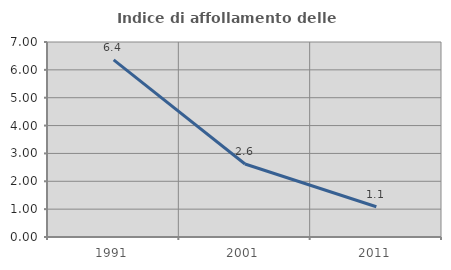
| Category | Indice di affollamento delle abitazioni  |
|---|---|
| 1991.0 | 6.36 |
| 2001.0 | 2.619 |
| 2011.0 | 1.086 |